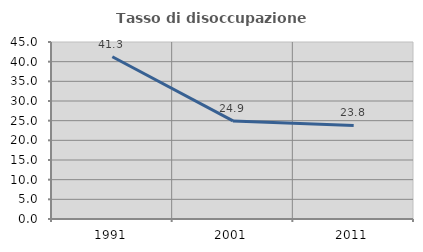
| Category | Tasso di disoccupazione giovanile  |
|---|---|
| 1991.0 | 41.253 |
| 2001.0 | 24.934 |
| 2011.0 | 23.785 |